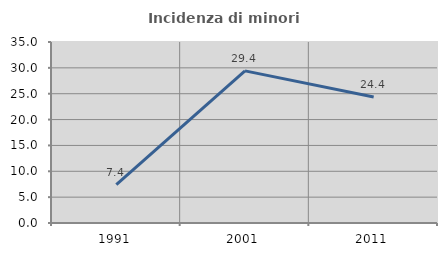
| Category | Incidenza di minori stranieri |
|---|---|
| 1991.0 | 7.407 |
| 2001.0 | 29.412 |
| 2011.0 | 24.377 |